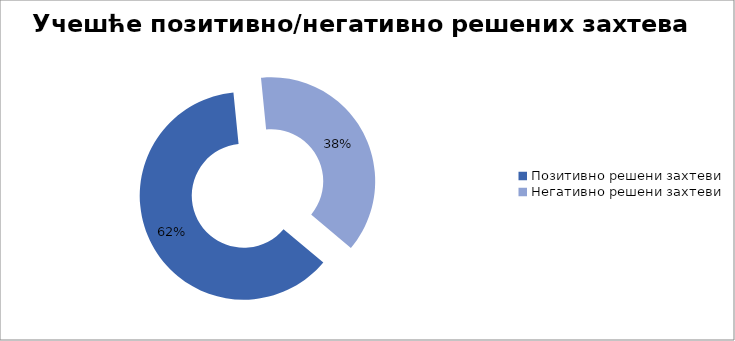
| Category | Series 0 |
|---|---|
| Позитивно решени захтеви | 10562 |
| Негативно решени захтеви | 6389 |